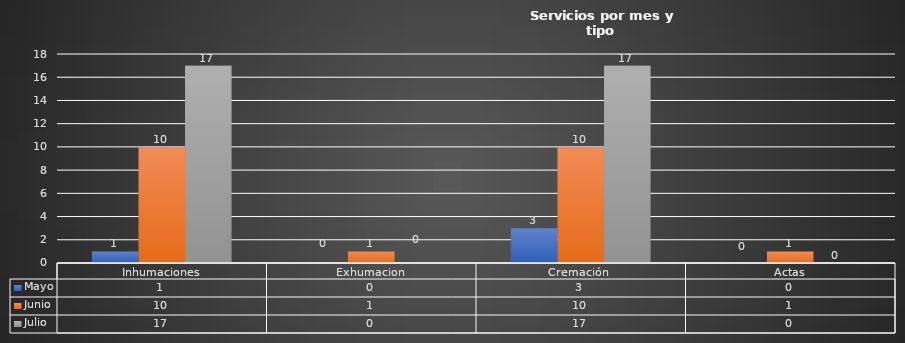
| Category | Mayo  | Junio | Julio |
|---|---|---|---|
| Inhumaciones | 1 | 10 | 17 |
| Exhumacion | 0 | 1 | 0 |
| Cremación  | 3 | 10 | 17 |
| Actas | 0 | 1 | 0 |